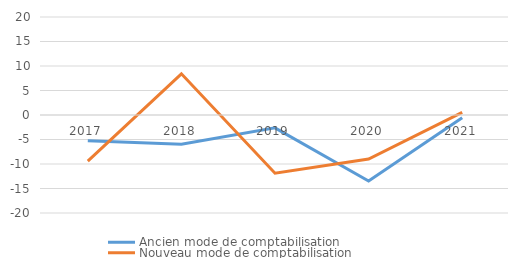
| Category | Ancien mode de comptabilisation | Nouveau mode de comptabilisation |
|---|---|---|
| 2017.0 | -5.275 | -9.412 |
| 2018.0 | -5.981 | 8.409 |
| 2019.0 | -2.624 | -11.871 |
| 2020.0 | -13.465 | -8.984 |
| 2021.0 | -0.551 | 0.543 |